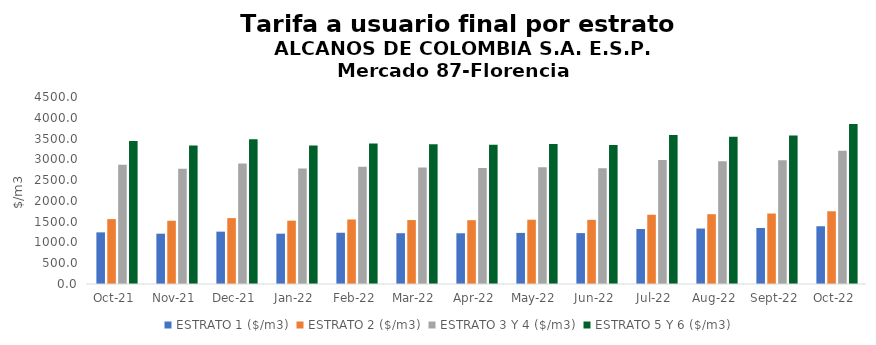
| Category | ESTRATO 1 ($/m3) | ESTRATO 2 ($/m3) | ESTRATO 3 Y 4 ($/m3) | ESTRATO 5 Y 6 ($/m3) |
|---|---|---|---|---|
| 2021-10-01 | 1242.28 | 1561.45 | 2868 | 3441.6 |
| 2021-11-01 | 1210.94 | 1521.89 | 2775.81 | 3330.972 |
| 2021-12-01 | 1260.02 | 1585.16 | 2902.39 | 3482.868 |
| 2022-01-01 | 1211.22 | 1524.02 | 2778.76 | 3334.512 |
| 2022-02-01 | 1233.39 | 1552.41 | 2818.77 | 3382.524 |
| 2022-03-01 | 1222.16 | 1538.54 | 2801.57 | 3361.884 |
| 2022-04-01 | 1220.79 | 1535.57 | 2791.83 | 3350.196 |
| 2022-05-01 | 1229.71 | 1546.92 | 2808.77 | 3370.524 |
| 2022-06-01 | 1224.76 | 1543.76 | 2787.21 | 3344.652 |
| 2022-07-01 | 1324.23 | 1665.88 | 2986.65 | 3583.98 |
| 2022-08-01 | 1334.86 | 1679.33 | 2951.9 | 3542.28 |
| 2022-09-01 | 1348.44 | 1696.41 | 2979.32 | 3575.184 |
| 2022-10-01 | 1390.28 | 1750.02 | 3208.12 | 3849.744 |